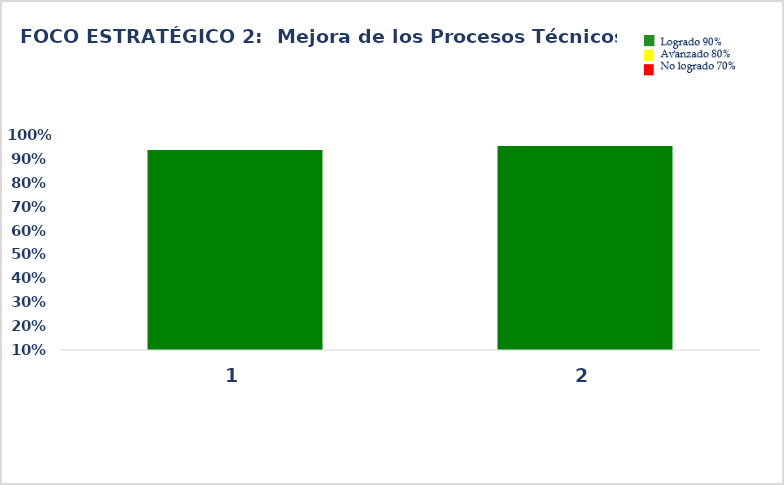
| Category | Series 0 |
|---|---|
| 1.0 | 0.938 |
| 2.0 | 0.954 |